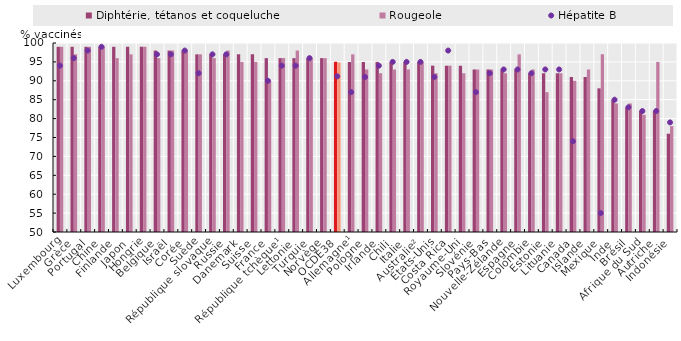
| Category | Diphtérie, tétanos et coqueluche | Rougeole |
|---|---|---|
| Luxembourg | 99 | 99 |
| Grèce | 99 | 97 |
| Portugal | 99 | 99 |
| Chine | 99 | 99 |
| Finlande | 99 | 96 |
| Japon | 99 | 97 |
| Hongrie | 99 | 99 |
| Belgique | 98 | 96 |
| Israël | 98 | 98 |
| Corée | 98 | 98 |
| Suède | 97 | 97 |
| République slovaque | 97 | 96 |
| Russie | 97 | 98 |
| Danemark | 97 | 95 |
| Suisse | 97 | 95 |
| France | 96 | 90 |
| République tchèque¹ | 96 | 96 |
| Lettonie | 96 | 98 |
| Turquie | 96 | 96 |
| Norvège | 96 | 96 |
| OCDE38 | 95.06 | 94.833 |
| Allemagne¹ | 95 | 97 |
| Pologne | 95 | 93 |
| Irlande | 95 | 92 |
| Chili | 95 | 93 |
| Italie | 95 | 93 |
| Australie² | 95 | 95 |
| États-Unis | 94 | 92 |
| Costa Rica | 94 | 94 |
| Royaume-Uni | 94 | 92 |
| Slovénie | 93 | 93 |
| Pays-Bas | 93 | 93 |
| Nouvelle-Zélande | 93 | 92 |
| Espagne | 93 | 97 |
| Colombie | 92 | 93 |
| Estonie | 92 | 87 |
| Lituanie | 92 | 92 |
| Canada | 91 | 90 |
| Islande | 91 | 93 |
| Mexique | 88 | 97 |
| Inde | 85 | 84 |
| Brésil | 83 | 84 |
| Afrique du Sud | 82 | 81 |
| Autriche | 82 | 95 |
| Indonésie | 76 | 78 |